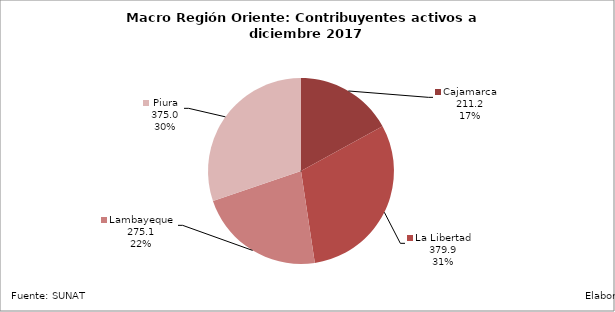
| Category | Contribuyentes |
|---|---|
| Cajamarca | 211.183 |
| La Libertad | 379.912 |
| Lambayeque | 275.145 |
| Piura | 374.97 |